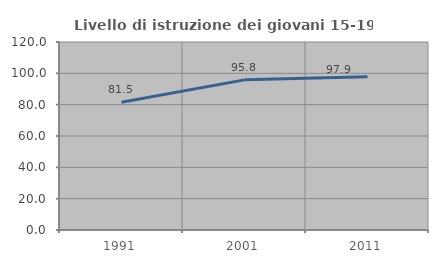
| Category | Livello di istruzione dei giovani 15-19 anni |
|---|---|
| 1991.0 | 81.481 |
| 2001.0 | 95.833 |
| 2011.0 | 97.872 |